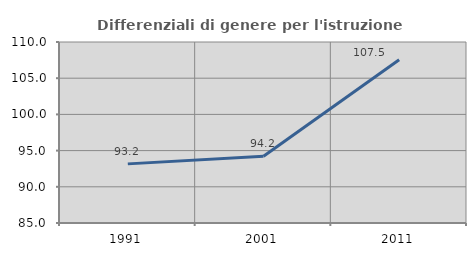
| Category | Differenziali di genere per l'istruzione superiore |
|---|---|
| 1991.0 | 93.166 |
| 2001.0 | 94.228 |
| 2011.0 | 107.54 |